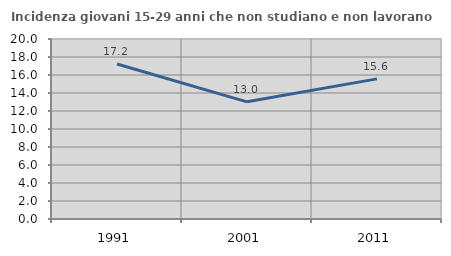
| Category | Incidenza giovani 15-29 anni che non studiano e non lavorano  |
|---|---|
| 1991.0 | 17.215 |
| 2001.0 | 13.018 |
| 2011.0 | 15.569 |